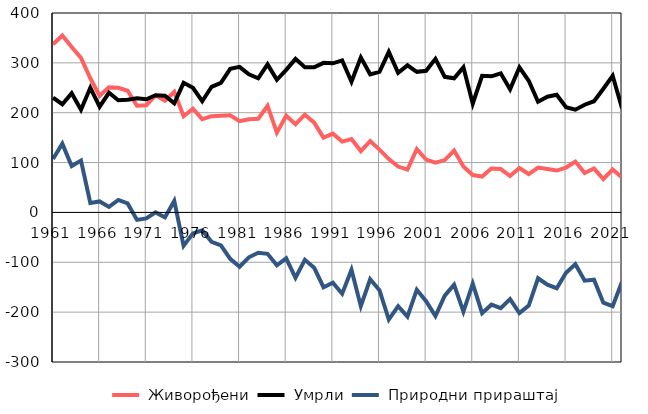
| Category |  Живорођени |  Умрли |  Природни прираштај |
|---|---|---|---|
| 1961.0 | 337 | 230 | 107 |
| 1962.0 | 355 | 217 | 138 |
| 1963.0 | 332 | 239 | 93 |
| 1964.0 | 310 | 206 | 104 |
| 1965.0 | 269 | 250 | 19 |
| 1966.0 | 234 | 212 | 22 |
| 1967.0 | 251 | 240 | 11 |
| 1968.0 | 250 | 225 | 25 |
| 1969.0 | 244 | 226 | 18 |
| 1970.0 | 214 | 229 | -15 |
| 1971.0 | 215 | 227 | -12 |
| 1972.0 | 235 | 235 | 0 |
| 1973.0 | 224 | 234 | -10 |
| 1974.0 | 242 | 219 | 23 |
| 1975.0 | 193 | 260 | -67 |
| 1976.0 | 208 | 250 | -42 |
| 1977.0 | 187 | 223 | -36 |
| 1978.0 | 193 | 252 | -59 |
| 1979.0 | 194 | 260 | -66 |
| 1980.0 | 195 | 288 | -93 |
| 1981.0 | 183 | 292 | -109 |
| 1982.0 | 187 | 277 | -90 |
| 1983.0 | 188 | 269 | -81 |
| 1984.0 | 214 | 297 | -83 |
| 1985.0 | 160 | 266 | -106 |
| 1986.0 | 194 | 286 | -92 |
| 1987.0 | 177 | 308 | -131 |
| 1988.0 | 196 | 291 | -95 |
| 1989.0 | 180 | 291 | -111 |
| 1990.0 | 150 | 300 | -150 |
| 1991.0 | 158 | 299 | -141 |
| 1992.0 | 142 | 305 | -163 |
| 1993.0 | 147 | 262 | -115 |
| 1994.0 | 123 | 311 | -188 |
| 1995.0 | 143 | 277 | -134 |
| 1996.0 | 126 | 282 | -156 |
| 1997.0 | 107 | 322 | -215 |
| 1998.0 | 92 | 280 | -188 |
| 1999.0 | 86 | 295 | -209 |
| 2000.0 | 127 | 282 | -155 |
| 2001.0 | 106 | 284 | -178 |
| 2002.0 | 100 | 308 | -208 |
| 2003.0 | 105 | 272 | -167 |
| 2004.0 | 124 | 269 | -145 |
| 2005.0 | 92 | 291 | -199 |
| 2006.0 | 75 | 218 | -143 |
| 2007.0 | 72 | 274 | -202 |
| 2008.0 | 88 | 273 | -185 |
| 2009.0 | 87 | 279 | -192 |
| 2010.0 | 73 | 247 | -174 |
| 2011.0 | 89 | 291 | -202 |
| 2012.0 | 77 | 264 | -187 |
| 2013.0 | 90 | 222 | -132 |
| 2014.0 | 87 | 232 | -145 |
| 2015.0 | 84 | 236 | -152 |
| 2016.0 | 90 | 211 | -121 |
| 2017.0 | 102 | 206 | -104 |
| 2018.0 | 79 | 216 | -137 |
| 2019.0 | 88 | 223 | -135 |
| 2020.0 | 67 | 248 | -181 |
| 2021.0 | 86 | 274 | -188 |
| 2022.0 | 70 | 209 | -139 |